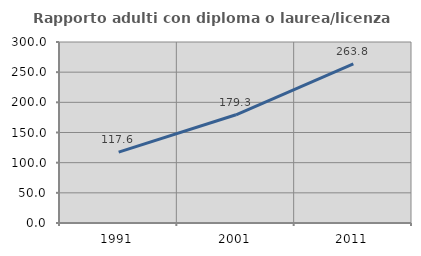
| Category | Rapporto adulti con diploma o laurea/licenza media  |
|---|---|
| 1991.0 | 117.562 |
| 2001.0 | 179.331 |
| 2011.0 | 263.77 |